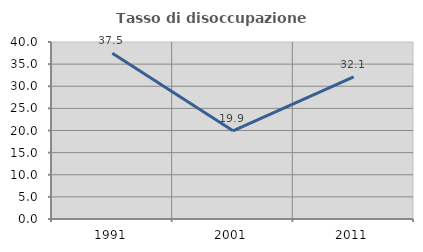
| Category | Tasso di disoccupazione giovanile  |
|---|---|
| 1991.0 | 37.48 |
| 2001.0 | 19.926 |
| 2011.0 | 32.127 |